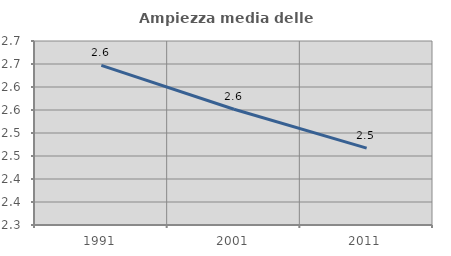
| Category | Ampiezza media delle famiglie |
|---|---|
| 1991.0 | 2.647 |
| 2001.0 | 2.552 |
| 2011.0 | 2.467 |